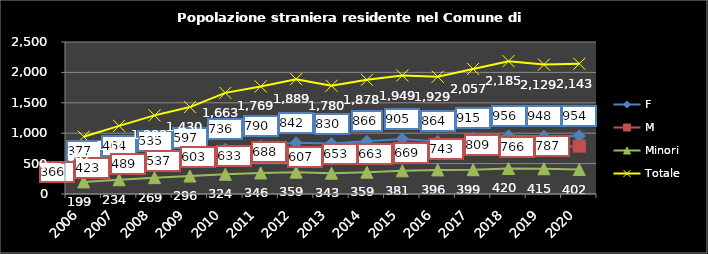
| Category | F | M | Minori | Totale |
|---|---|---|---|---|
| 2006.0 | 377 | 366 | 199 | 942 |
| 2007.0 | 464 | 423 | 234 | 1121 |
| 2008.0 | 535 | 489 | 269 | 1293 |
| 2009.0 | 597 | 537 | 296 | 1430 |
| 2010.0 | 736 | 603 | 324 | 1663 |
| 2011.0 | 790 | 633 | 346 | 1769 |
| 2012.0 | 842 | 688 | 359 | 1889 |
| 2013.0 | 830 | 607 | 343 | 1780 |
| 2014.0 | 866 | 653 | 359 | 1878 |
| 2015.0 | 905 | 663 | 381 | 1949 |
| 2016.0 | 864 | 669 | 396 | 1929 |
| 2017.0 | 915 | 743 | 399 | 2057 |
| 2018.0 | 956 | 809 | 420 | 2185 |
| 2019.0 | 948 | 766 | 415 | 2129 |
| 2020.0 | 954 | 787 | 402 | 2143 |